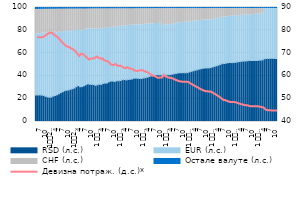
| Category | RSD (л.с.) | EUR (л.с.) | CHF (л.с.) | Остале валуте (л.с.) |
|---|---|---|---|---|
| 7 | 23.242 | 53.572 | 22.377 | 0.809 |
| 8 | 23.278 | 53.599 | 22.336 | 0.787 |
| 9 | 23.304 | 53.823 | 22.113 | 0.76 |
| 10 | 23.177 | 54.262 | 21.83 | 0.73 |
| 11 | 22.829 | 54.757 | 21.709 | 0.704 |
| 12 | 22.081 | 55.553 | 21.683 | 0.683 |
| 1
2010. | 21.56 | 55.833 | 21.941 | 0.666 |
| 2 | 21.226 | 56.306 | 21.818 | 0.65 |
| 3 | 21.411 | 56.185 | 21.769 | 0.635 |
| 4 | 22.28 | 55.885 | 21.229 | 0.605 |
| 5 | 22.785 | 55.557 | 21.076 | 0.582 |
| 6 | 23.414 | 54.176 | 21.858 | 0.552 |
| 7 | 24.365 | 54.109 | 20.993 | 0.534 |
| 8 | 25.354 | 52.805 | 21.322 | 0.519 |
| 9 | 26.159 | 52.698 | 20.635 | 0.509 |
| 10 | 27.04 | 52.604 | 19.868 | 0.488 |
| 11 | 27.418 | 51.862 | 20.27 | 0.45 |
| 12 | 27.629 | 51.14 | 20.792 | 0.439 |
| 1
2011. | 28.269 | 51.116 | 20.189 | 0.425 |
| 2 | 28.712 | 50.828 | 20.039 | 0.421 |
| 3 | 29.374 | 50.782 | 19.44 | 0.404 |
| 4 | 30.501 | 50.11 | 19.006 | 0.383 |
| 5 | 31.469 | 48.767 | 19.392 | 0.372 |
| 6 | 30.471 | 49.552 | 19.617 | 0.36 |
| 7 | 30.617 | 48.914 | 20.131 | 0.338 |
| 8 | 31.466 | 48.82 | 19.381 | 0.333 |
| 9 | 32.205 | 48.824 | 18.653 | 0.318 |
| 10 | 33.016 | 48.366 | 18.317 | 0.301 |
| 11 | 32.626 | 48.776 | 18.297 | 0.3 |
| 12 | 32.567 | 48.83 | 18.362 | 0.241 |
| 1 
2012. | 32.446 | 48.832 | 18.486 | 0.235 |
| 2 | 31.713 | 49.385 | 18.667 | 0.234 |
| 3 | 32.192 | 49.056 | 18.523 | 0.229 |
| 4 | 32.643 | 48.693 | 18.44 | 0.225 |
| 5 | 32.539 | 48.784 | 18.456 | 0.222 |
| 6 | 33.392 | 48.224 | 18.168 | 0.216 |
| 7 | 33.65 | 48.09 | 18.047 | 0.213 |
| 8 | 33.829 | 48.042 | 17.918 | 0.21 |
| 9 | 34.792 | 47.54 | 17.468 | 0.199 |
| 10 | 35.398 | 47.171 | 17.239 | 0.193 |
| 11 | 35.436 | 47.221 | 17.157 | 0.186 |
| 12 | 35.032 | 47.638 | 17.144 | 0.186 |
| 1 
2013. | 35.736 | 47.461 | 16.617 | 0.185 |
| 2 | 35.733 | 47.408 | 16.675 | 0.184 |
| 3 | 35.91 | 47.383 | 16.538 | 0.169 |
| 4 | 36.576 | 47.095 | 16.156 | 0.173 |
| 5 | 36.845 | 47.18 | 15.798 | 0.178 |
| 6 | 36.393 | 47.543 | 15.894 | 0.169 |
| 7 | 36.877 | 47.306 | 15.652 | 0.165 |
| 8 | 37.052 | 47.359 | 15.427 | 0.162 |
| 9 | 37.333 | 47.147 | 15.363 | 0.158 |
| 10 | 37.962 | 46.868 | 15.05 | 0.12 |
| 11 | 38.052 | 46.867 | 14.958 | 0.123 |
| 12 | 37.907 | 47.01 | 14.961 | 0.122 |
| 1 
2014. | 37.777 | 47.104 | 15.012 | 0.107 |
| 2 | 37.715 | 47.15 | 15.032 | 0.103 |
| 3 | 38.189 | 46.895 | 14.81 | 0.106 |
| 4 | 38.453 | 46.777 | 14.669 | 0.101 |
| 5 | 38.829 | 46.579 | 14.493 | 0.099 |
| 6 | 39.469 | 46.107 | 14.329 | 0.096 |
| 7 | 39.988 | 45.764 | 14.165 | 0.084 |
| 8 | 40.17 | 45.564 | 14.182 | 0.084 |
| 9 | 40.597 | 45.261 | 14.063 | 0.079 |
| 10 | 41.092 | 44.932 | 13.9 | 0.075 |
| 11 | 40.9 | 45.095 | 13.929 | 0.077 |
| 12 | 40.957 | 45.117 | 13.862 | 0.064 |
| 1 
2015. | 39.692 | 44.525 | 15.719 | 0.063 |
| 2 | 40.459 | 44.261 | 15.217 | 0.063 |
| 3 | 40.811 | 43.998 | 15.129 | 0.062 |
| 4 | 41.032 | 43.932 | 14.975 | 0.061 |
| 5 | 41.119 | 43.942 | 14.888 | 0.051 |
| 6 | 41.451 | 43.967 | 14.527 | 0.055 |
| 7 | 41.928 | 43.955 | 14.062 | 0.055 |
| 8 | 42.198 | 44.09 | 13.657 | 0.054 |
| 9 | 42.581 | 44.058 | 13.307 | 0.054 |
| 10 | 42.658 | 44.041 | 13.248 | 0.054 |
| 11 | 42.778 | 44.079 | 13.09 | 0.053 |
| 12 | 42.841 | 44.076 | 13.03 | 0.052 |
| 1 
2016. | 42.767 | 44.449 | 12.732 | 0.052 |
| 2 | 42.93 | 44.22 | 12.791 | 0.059 |
| 3 | 43.541 | 43.896 | 12.505 | 0.059 |
| 4 | 43.999 | 43.716 | 12.228 | 0.056 |
| 5 | 44.514 | 43.457 | 11.975 | 0.055 |
| 6 | 44.96 | 43.106 | 11.881 | 0.053 |
| 7 | 45.37 | 42.873 | 11.704 | 0.052 |
| 8 | 45.955 | 42.63 | 11.364 | 0.051 |
| 9 | 46.274 | 42.376 | 11.3 | 0.05 |
| 10 | 46.717 | 42.116 | 11.12 | 0.047 |
| 11 | 46.928 | 41.999 | 11.03 | 0.044 |
| 12 | 47.008 | 42.092 | 10.864 | 0.035 |
| 1 
2017. | 47.021 | 42.08 | 10.863 | 0.036 |
| 2 | 47.28 | 42 | 10.685 | 0.036 |
| 3 | 47.846 | 41.728 | 10.394 | 0.032 |
| 4 | 48.314 | 41.577 | 10.072 | 0.038 |
| 5 | 48.862 | 41.376 | 9.726 | 0.036 |
| 6 | 49.436 | 41.132 | 9.396 | 0.036 |
| 7 | 50.045 | 41.046 | 8.874 | 0.035 |
| 8 | 50.729 | 40.67 | 8.567 | 0.034 |
| 9 | 50.846 | 40.82 | 8.314 | 0.02 |
| 10 | 51.203 | 40.731 | 8.046 | 0.019 |
| 11 | 51.488 | 40.669 | 7.824 | 0.019 |
| 12 | 51.744 | 40.59 | 7.653 | 0.015 |
| 1 
2018. | 51.626 | 40.623 | 7.739 | 0.012 |
| 2 | 51.734 | 40.614 | 7.641 | 0.011 |
| 3 | 51.909 | 40.764 | 7.316 | 0.011 |
| 4 | 52.243 | 40.718 | 7.028 | 0.011 |
| 5 | 52.549 | 40.36 | 7.081 | 0.01 |
| 6 | 52.748 | 40.366 | 6.876 | 0.01 |
| 7 | 53.014 | 40.235 | 6.741 | 0.01 |
| 8 | 53.073 | 40.167 | 6.751 | 0.009 |
| 9 | 53.203 | 40.187 | 6.602 | 0.009 |
| 10 | 53.542 | 40 | 6.449 | 0.008 |
| 11 | 53.507 | 40.127 | 6.357 | 0.008 |
| 12 | 53.56 | 40.343 | 6.08 | 0.017 |
| 1 
2019. | 53.531 | 40.512 | 5.943 | 0.001 |
| 2 | 53.531 | 40.568 | 5.88 | 0.001 |
| 3 | 53.721 | 40.426 | 5.832 | 0.001 |
| 4 | 53.827 | 40.536 | 5.624 | 0.001 |
| 5 | 54.112 | 41.099 | 4.782 | 0 |
| 6 | 54.978 | 44.126 | 0.889 | 0 |
| 7 | 55.239 | 44.418 | 0.336 | 0 |
| 8 | 55.233 | 44.442 | 0.319 | 0 |
| 9 | 55.353 | 44.334 | 0.307 | 0 |
| 10 | 55.424 | 44.276 | 0.293 | 0 |
| 11 | 55.351 | 44.361 | 0.282 | 0 |
| 12 | 55.345 | 44.382 | 0.267 | 0 |